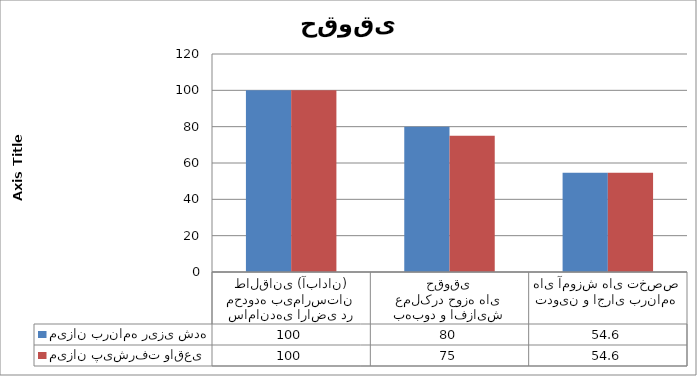
| Category | میزان برنامه ریزی شده | میزان پیشرفت واقعی |
|---|---|---|
| ساماندهی اراضی در محدوده بیمارستان طالقانی (آبادان) | 100 | 100 |
| بهبود و افزایش عملکرد حوزه های حقوقی | 80 | 75 |
| تدوین و اجرای برنامه های آموزش های تخصص | 54.6 | 54.6 |